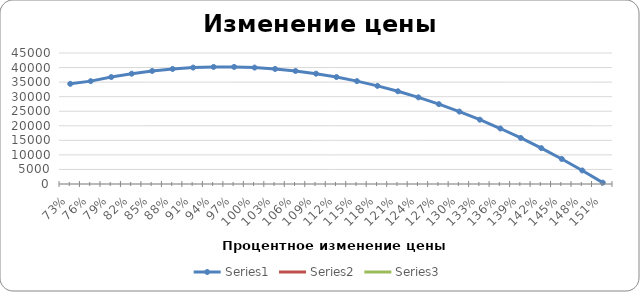
| Category | Series 0 | Series 1 | Series 2 |
|---|---|---|---|
| 0.73 | 34410 | 0 | 0 |
| 0.76 | 35340 | 0 | 0 |
| 0.79 | 36735 | 0 | 0 |
| 0.82 | 37897.5 | 0 | 0 |
| 0.85 | 38827.5 | 0 | 0 |
| 0.88 | 39525 | 0 | 0 |
| 0.91 | 39990 | 0 | 0 |
| 0.94 | 40222.5 | 0 | 0 |
| 0.97 | 40222.5 | 0 | 0 |
| 1.0 | 39990 | 0 | 0 |
| 1.03 | 39525 | 0 | 0 |
| 1.06 | 38827.5 | 0 | 0 |
| 1.09 | 37897.5 | 0 | 0 |
| 1.12 | 36735 | 0 | 0 |
| 1.15 | 35340 | 0 | 0 |
| 1.18 | 33712.5 | 0 | 0 |
| 1.21 | 31852.5 | 0 | 0 |
| 1.24 | 2976 | 0 | 0 |
| 1.27 | 27435 | 0 | 0 |
| 1.3 | 24877.5 | 0 | 0 |
| 1.33 | 22087.5 | 0 | 0 |
| 1.36 | 19065 | 0 | 0 |
| 1.39 | 1581 | 0 | 0 |
| 1.42 | 12322.5 | 0 | 0 |
| 1.45 | 8602.5 | 0 | 0 |
| 1.48 | 4650 | 0 | 0 |
| 1.51 | 465 | 0 | 0 |